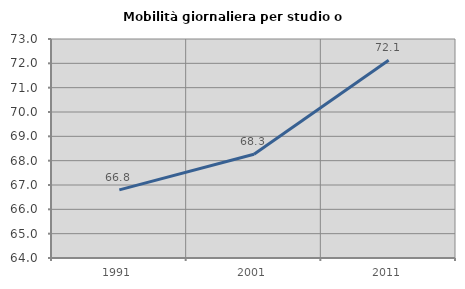
| Category | Mobilità giornaliera per studio o lavoro |
|---|---|
| 1991.0 | 66.801 |
| 2001.0 | 68.262 |
| 2011.0 | 72.127 |